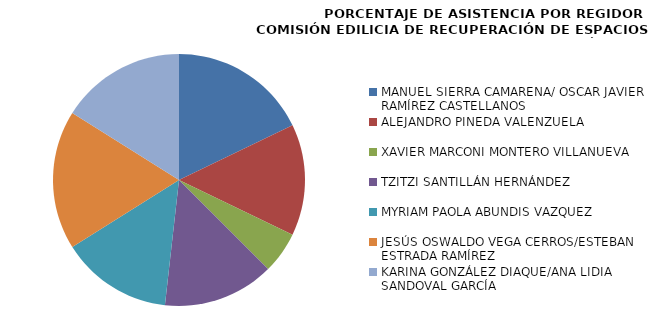
| Category | Series 0 |
|---|---|
| MANUEL SIERRA CAMARENA/ OSCAR JAVIER RAMÍREZ CASTELLANOS | 100 |
| ALEJANDRO PINEDA VALENZUELA | 80 |
| XAVIER MARCONI MONTERO VILLANUEVA | 30 |
| TZITZI SANTILLÁN HERNÁNDEZ | 80 |
| MYRIAM PAOLA ABUNDIS VAZQUEZ | 80 |
| JESÚS OSWALDO VEGA CERROS/ESTEBAN ESTRADA RAMÍREZ | 100 |
| KARINA GONZÁLEZ DIAQUE/ANA LIDIA SANDOVAL GARCÍA | 90 |